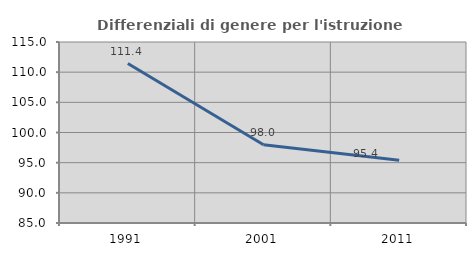
| Category | Differenziali di genere per l'istruzione superiore |
|---|---|
| 1991.0 | 111.434 |
| 2001.0 | 97.969 |
| 2011.0 | 95.406 |